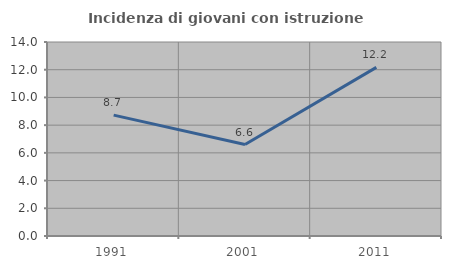
| Category | Incidenza di giovani con istruzione universitaria |
|---|---|
| 1991.0 | 8.721 |
| 2001.0 | 6.599 |
| 2011.0 | 12.169 |